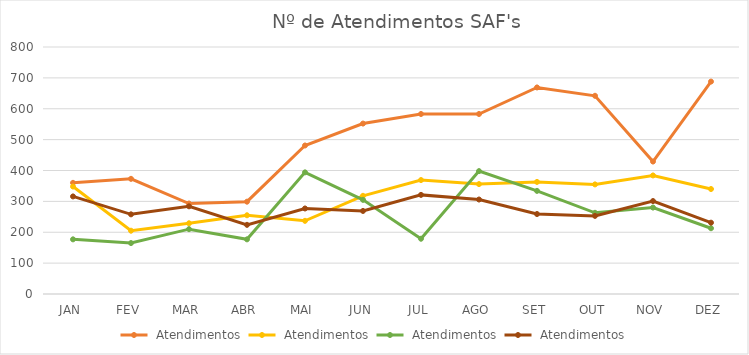
| Category | Bonsucesso | Recreio | Herdeiros | Sede |
|---|---|---|---|---|
| JAN | 360 | 348 | 177 | 316 |
| FEV | 373 | 205 | 165 | 258 |
| MAR | 293 | 229 | 210 | 284 |
| ABR | 299 | 255 | 177 | 224 |
| MAI | 481 | 237 | 394 | 277 |
| JUN | 552 | 318 | 305 | 269 |
| JUL | 583 | 369 | 179 | 321 |
| AGO | 583 | 356 | 398 | 306 |
| SET | 669 | 363 | 334 | 259 |
| OUT | 642 | 355 | 263 | 253 |
| NOV | 429 | 384 | 280 | 301 |
| DEZ | 688 | 340 | 213 | 231 |